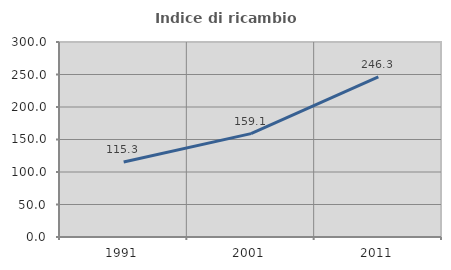
| Category | Indice di ricambio occupazionale  |
|---|---|
| 1991.0 | 115.254 |
| 2001.0 | 159.091 |
| 2011.0 | 246.341 |